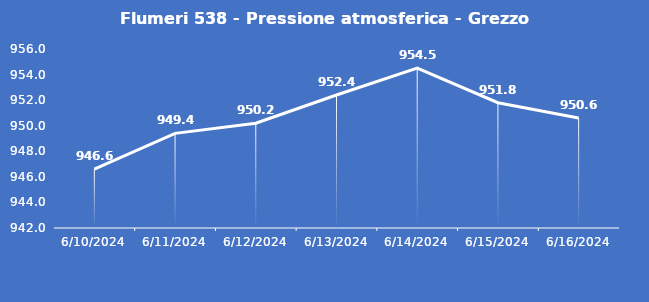
| Category | Flumeri 538 - Pressione atmosferica - Grezzo (hPa) |
|---|---|
| 6/10/24 | 946.6 |
| 6/11/24 | 949.4 |
| 6/12/24 | 950.2 |
| 6/13/24 | 952.4 |
| 6/14/24 | 954.5 |
| 6/15/24 | 951.8 |
| 6/16/24 | 950.6 |